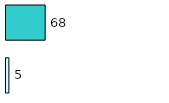
| Category | Series 0 | Series 1 |
|---|---|---|
| 0 | 5 | 68 |